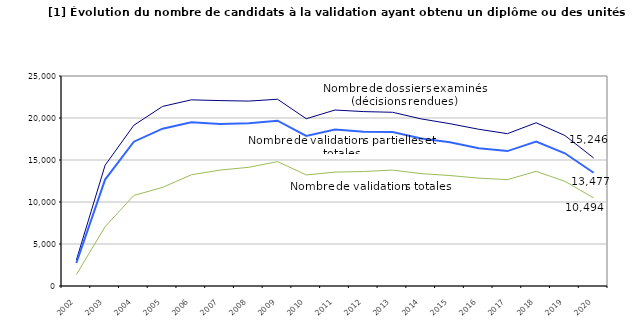
| Category | Nombre de dossiers examinés (décisions rendues) | Nombre de validations partielles et totales | Nombre de validations totales |
|---|---|---|---|
| 2002.0 | 3089 | 2740 | 1360 |
| 2003.0 | 14374 | 12670 | 7060 |
| 2004.0 | 19136 | 17180 | 10780 |
| 2005.0 | 21379 | 18730 | 11740 |
| 2006.0 | 22160 | 19480 | 13240 |
| 2007.0 | 22073 | 19300 | 13800 |
| 2008.0 | 22013 | 19380 | 14130 |
| 2009.0 | 22234 | 19680 | 14810 |
| 2010.0 | 19914 | 17860 | 13220 |
| 2011.0 | 20950 | 18640 | 13560 |
| 2012.0 | 20762 | 18360 | 13630 |
| 2013.0 | 20682 | 18320 | 13800 |
| 2014.0 | 19893 | 17550 | 13380 |
| 2015.0 | 19324 | 17100 | 13150 |
| 2016.0 | 18660 | 16400 | 12840 |
| 2017.0 | 18135 | 16060 | 12660 |
| 2018.0 | 19436 | 17190 | 13650 |
| 2019.0 | 17913 | 15800 | 12460 |
| 2020.0 | 15246 | 13477 | 10494 |